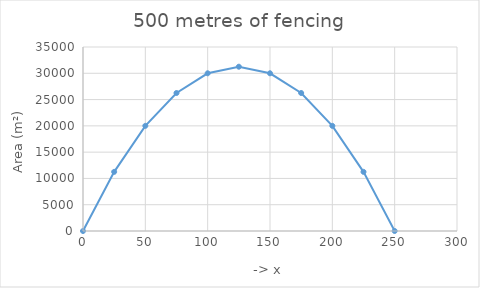
| Category | Area (m²) |
|---|---|
| 0.0 | 0 |
| 25.0 | 11250 |
| 50.0 | 20000 |
| 75.0 | 26250 |
| 100.0 | 30000 |
| 125.0 | 31250 |
| 150.0 | 30000 |
| 175.0 | 26250 |
| 200.0 | 20000 |
| 225.0 | 11250 |
| 250.0 | 0 |